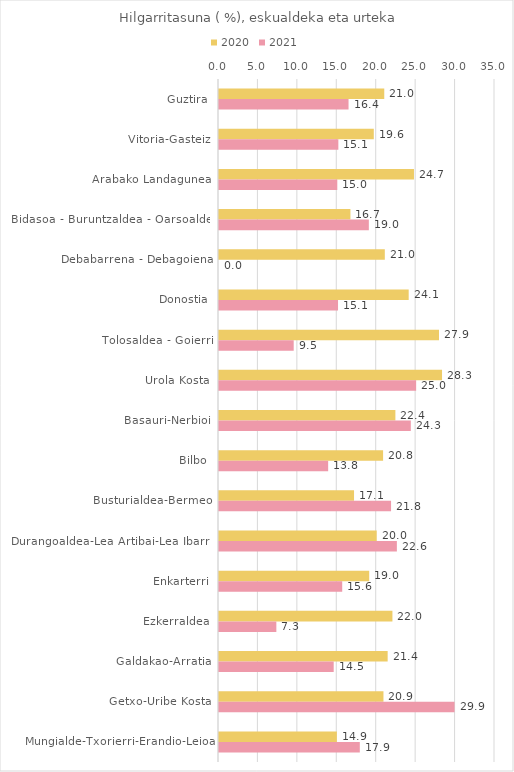
| Category | 2020 | 2021 |
|---|---|---|
| Guztira | 20.957 | 16.427 |
| Vitoria-Gasteiz | 19.63 | 15.135 |
| Arabako Landagunea | 24.725 | 15 |
| Bidasoa - Buruntzaldea - Oarsoaldea | 16.667 | 19 |
| Debabarrena - Debagoiena | 21.027 | 0 |
| Donostia | 24.055 | 15.094 |
| Tolosaldea - Goierri | 27.899 | 9.474 |
| Urola Kosta | 28.283 | 25 |
| Basauri-Nerbioi | 22.368 | 24.324 |
| Bilbo | 20.809 | 13.842 |
| Busturialdea-Bermeo | 17.123 | 21.818 |
| Durangoaldea-Lea Artibai-Lea Ibarra | 20 | 22.556 |
| Enkarterri | 19.048 | 15.625 |
| Ezkerraldea | 21.992 | 7.273 |
| Galdakao-Arratia | 21.387 | 14.545 |
| Getxo-Uribe Kosta | 20.856 | 29.87 |
| Mungialde-Txorierri-Erandio-Leioa | 14.946 | 17.857 |